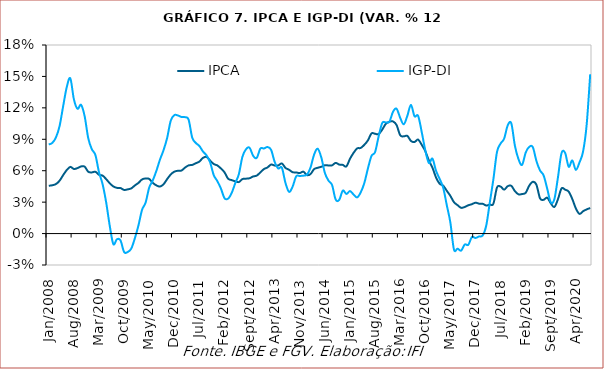
| Category | IPCA | IGP-DI |
|---|---|---|
| 2008-01-01 | 0.046 | 0.085 |
| 2008-02-01 | 0.046 | 0.087 |
| 2008-03-01 | 0.047 | 0.092 |
| 2008-04-01 | 0.05 | 0.103 |
| 2008-05-01 | 0.056 | 0.121 |
| 2008-06-01 | 0.061 | 0.14 |
| 2008-07-01 | 0.064 | 0.148 |
| 2008-08-01 | 0.062 | 0.128 |
| 2008-09-01 | 0.063 | 0.119 |
| 2008-10-01 | 0.064 | 0.123 |
| 2008-11-01 | 0.064 | 0.112 |
| 2008-12-01 | 0.059 | 0.091 |
| 2009-01-01 | 0.058 | 0.08 |
| 2009-02-01 | 0.059 | 0.075 |
| 2009-03-01 | 0.056 | 0.059 |
| 2009-04-01 | 0.055 | 0.047 |
| 2009-05-01 | 0.052 | 0.03 |
| 2009-06-01 | 0.048 | 0.007 |
| 2009-07-01 | 0.045 | -0.01 |
| 2009-08-01 | 0.044 | -0.005 |
| 2009-09-01 | 0.043 | -0.007 |
| 2009-10-01 | 0.042 | -0.018 |
| 2009-11-01 | 0.042 | -0.018 |
| 2009-12-01 | 0.043 | -0.014 |
| 2010-01-01 | 0.046 | -0.005 |
| 2010-02-01 | 0.048 | 0.008 |
| 2010-03-01 | 0.052 | 0.023 |
| 2010-04-01 | 0.053 | 0.03 |
| 2010-05-01 | 0.052 | 0.044 |
| 2010-06-01 | 0.048 | 0.051 |
| 2010-07-01 | 0.046 | 0.06 |
| 2010-08-01 | 0.045 | 0.071 |
| 2010-09-01 | 0.047 | 0.08 |
| 2010-10-01 | 0.052 | 0.091 |
| 2010-11-01 | 0.056 | 0.108 |
| 2010-12-01 | 0.059 | 0.113 |
| 2011-01-01 | 0.06 | 0.113 |
| 2011-02-01 | 0.06 | 0.111 |
| 2011-03-01 | 0.063 | 0.111 |
| 2011-04-01 | 0.065 | 0.109 |
| 2011-05-01 | 0.066 | 0.092 |
| 2011-06-01 | 0.067 | 0.087 |
| 2011-07-01 | 0.069 | 0.084 |
| 2011-08-01 | 0.072 | 0.078 |
| 2011-09-01 | 0.073 | 0.075 |
| 2011-10-01 | 0.07 | 0.068 |
| 2011-11-01 | 0.066 | 0.056 |
| 2011-12-01 | 0.065 | 0.05 |
| 2012-01-01 | 0.062 | 0.043 |
| 2012-02-01 | 0.058 | 0.034 |
| 2012-03-01 | 0.052 | 0.033 |
| 2012-04-01 | 0.051 | 0.039 |
| 2012-05-01 | 0.05 | 0.048 |
| 2012-06-01 | 0.049 | 0.057 |
| 2012-07-01 | 0.052 | 0.073 |
| 2012-08-01 | 0.052 | 0.08 |
| 2012-09-01 | 0.053 | 0.082 |
| 2012-10-01 | 0.055 | 0.074 |
| 2012-11-01 | 0.055 | 0.072 |
| 2012-12-01 | 0.058 | 0.081 |
| 2013-01-01 | 0.062 | 0.081 |
| 2013-02-01 | 0.063 | 0.083 |
| 2013-03-01 | 0.066 | 0.08 |
| 2013-04-01 | 0.065 | 0.068 |
| 2013-05-01 | 0.065 | 0.062 |
| 2013-06-01 | 0.067 | 0.063 |
| 2013-07-01 | 0.063 | 0.048 |
| 2013-08-01 | 0.061 | 0.04 |
| 2013-09-01 | 0.059 | 0.045 |
| 2013-10-01 | 0.058 | 0.055 |
| 2013-11-01 | 0.058 | 0.055 |
| 2013-12-01 | 0.059 | 0.055 |
| 2014-01-01 | 0.056 | 0.056 |
| 2014-02-01 | 0.057 | 0.063 |
| 2014-03-01 | 0.062 | 0.075 |
| 2014-04-01 | 0.063 | 0.081 |
| 2014-05-01 | 0.064 | 0.073 |
| 2014-06-01 | 0.065 | 0.058 |
| 2014-07-01 | 0.065 | 0.051 |
| 2014-08-01 | 0.065 | 0.046 |
| 2014-09-01 | 0.067 | 0.033 |
| 2014-10-01 | 0.066 | 0.032 |
| 2014-11-01 | 0.066 | 0.041 |
| 2014-12-01 | 0.064 | 0.038 |
| 2015-01-01 | 0.071 | 0.041 |
| 2015-02-01 | 0.077 | 0.037 |
| 2015-03-01 | 0.081 | 0.035 |
| 2015-04-01 | 0.082 | 0.039 |
| 2015-05-01 | 0.085 | 0.048 |
| 2015-06-01 | 0.089 | 0.062 |
| 2015-07-01 | 0.096 | 0.074 |
| 2015-08-01 | 0.095 | 0.078 |
| 2015-09-01 | 0.095 | 0.093 |
| 2015-10-01 | 0.099 | 0.106 |
| 2015-11-01 | 0.105 | 0.106 |
| 2015-12-01 | 0.107 | 0.107 |
| 2016-01-01 | 0.107 | 0.116 |
| 2016-02-01 | 0.104 | 0.119 |
| 2016-03-01 | 0.094 | 0.111 |
| 2016-04-01 | 0.093 | 0.104 |
| 2016-05-01 | 0.093 | 0.112 |
| 2016-06-01 | 0.088 | 0.123 |
| 2016-07-01 | 0.087 | 0.112 |
| 2016-08-01 | 0.09 | 0.112 |
| 2016-09-01 | 0.085 | 0.097 |
| 2016-10-01 | 0.079 | 0.08 |
| 2016-11-01 | 0.07 | 0.067 |
| 2016-12-01 | 0.063 | 0.072 |
| 2017-01-01 | 0.054 | 0.06 |
| 2017-02-01 | 0.048 | 0.052 |
| 2017-03-01 | 0.046 | 0.044 |
| 2017-04-01 | 0.041 | 0.027 |
| 2017-05-01 | 0.036 | 0.01 |
| 2017-06-01 | 0.03 | -0.015 |
| 2017-07-01 | 0.027 | -0.014 |
| 2017-08-01 | 0.025 | -0.016 |
| 2017-09-01 | 0.025 | -0.01 |
| 2017-10-01 | 0.027 | -0.011 |
| 2017-11-01 | 0.028 | -0.003 |
| 2017-12-01 | 0.029 | -0.004 |
| 2018-01-01 | 0.029 | -0.003 |
| 2018-02-01 | 0.028 | -0.002 |
| 2018-03-01 | 0.027 | 0.008 |
| 2018-04-01 | 0.028 | 0.03 |
| 2018-05-01 | 0.029 | 0.052 |
| 2018-06-01 | 0.044 | 0.078 |
| 2018-07-01 | 0.045 | 0.086 |
| 2018-08-01 | 0.042 | 0.091 |
| 2018-09-01 | 0.045 | 0.103 |
| 2018-10-01 | 0.046 | 0.105 |
| 2018-11-01 | 0.04 | 0.084 |
| 2018-12-01 | 0.037 | 0.071 |
| 2019-01-01 | 0.038 | 0.066 |
| 2019-02-01 | 0.039 | 0.077 |
| 2019-03-01 | 0.046 | 0.083 |
| 2019-04-01 | 0.049 | 0.082 |
| 2019-05-01 | 0.047 | 0.069 |
| 2019-06-01 | 0.034 | 0.06 |
| 2019-07-01 | 0.032 | 0.056 |
| 2019-08-01 | 0.034 | 0.043 |
| 2019-09-01 | 0.029 | 0.03 |
| 2019-10-01 | 0.025 | 0.033 |
| 2019-11-01 | 0.033 | 0.054 |
| 2019-12-01 | 0.043 | 0.077 |
| 2020-01-01 | 0.042 | 0.077 |
| 2020-02-01 | 0.04 | 0.064 |
| 2020-03-01 | 0.033 | 0.07 |
| 2020-04-01 | 0.024 | 0.061 |
| 2020-05-01 | 0.019 | 0.068 |
| 2020-06-01 | 0.021 | 0.078 |
| 2020-07-01 | 0.023 | 0.104 |
| 2020-08-01 | 0.024 | 0.152 |